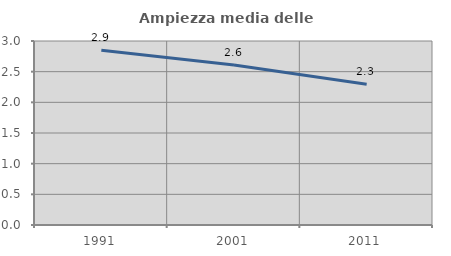
| Category | Ampiezza media delle famiglie |
|---|---|
| 1991.0 | 2.85 |
| 2001.0 | 2.61 |
| 2011.0 | 2.296 |